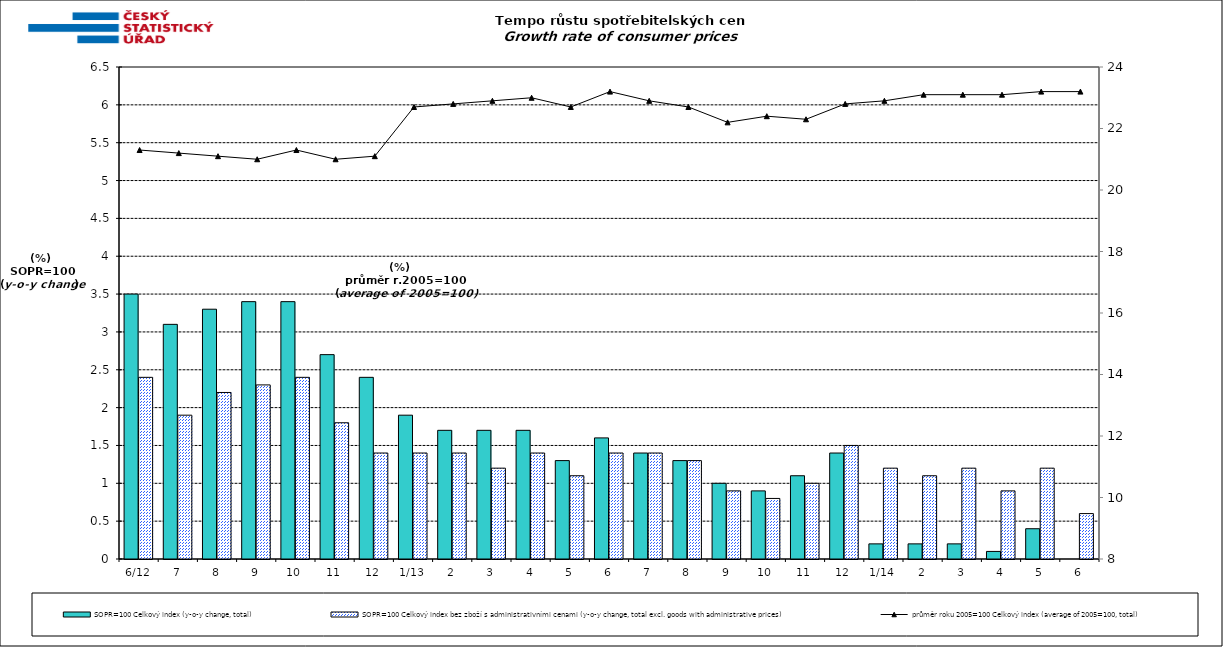
| Category | SOPR=100 Celkový index (y-o-y change, total) | SOPR=100 Celkový index bez zboží s administrativními cenami (y-o-y change, total excl. goods with administrative prices)  |
|---|---|---|
| 6/12 | 3.5 | 2.4 |
| 7 | 3.1 | 1.9 |
| 8 | 3.3 | 2.2 |
| 9 | 3.4 | 2.3 |
| 10 | 3.4 | 2.4 |
| 11 | 2.7 | 1.8 |
| 12 | 2.4 | 1.4 |
| 1/13 | 1.9 | 1.4 |
| 2 | 1.7 | 1.4 |
| 3 | 1.7 | 1.2 |
| 4 | 1.7 | 1.4 |
| 5 | 1.3 | 1.1 |
| 6 | 1.6 | 1.4 |
| 7 | 1.4 | 1.4 |
| 8 | 1.3 | 1.3 |
| 9 | 1 | 0.9 |
| 10 | 0.9 | 0.8 |
| 11 | 1.1 | 1 |
| 12 | 1.4 | 1.5 |
| 1/14 | 0.2 | 1.2 |
| 2 | 0.2 | 1.1 |
| 3 | 0.2 | 1.2 |
| 4 | 0.1 | 0.9 |
| 5 | 0.4 | 1.2 |
| 6 | 0 | 0.6 |